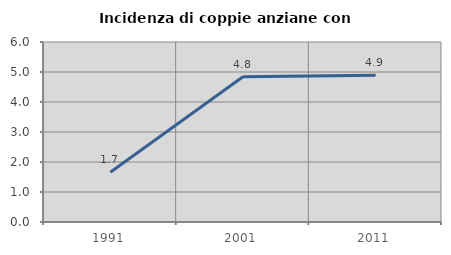
| Category | Incidenza di coppie anziane con figli |
|---|---|
| 1991.0 | 1.658 |
| 2001.0 | 4.844 |
| 2011.0 | 4.888 |